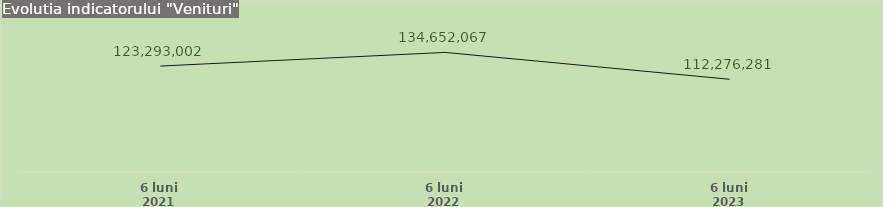
| Category | Series 1 |
|---|---|
| 6 luni 2021 | 123293002 |
| 6 luni 2022 | 134652067 |
| 6 luni 2023 | 112276281 |